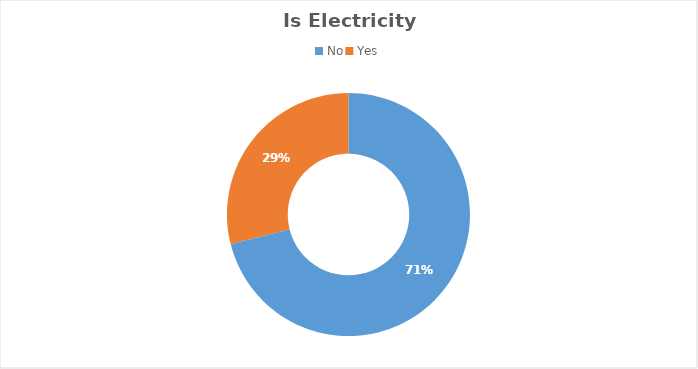
| Category | Series 0 |
|---|---|
| No | 0.711 |
| Yes | 0.289 |